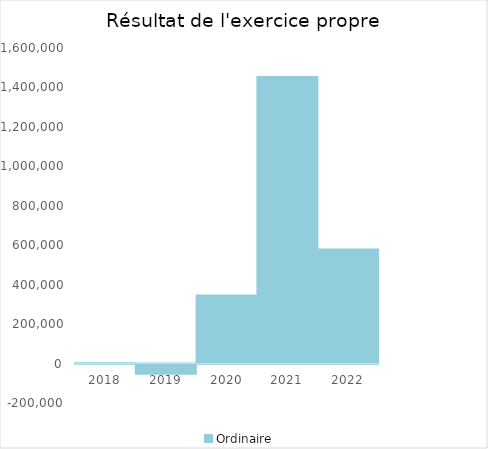
| Category |   | Ordinaire |    |
|---|---|---|---|
| 2018.0 |  | 1291.15 |  |
| 2019.0 |  | -49924.62 |  |
| 2020.0 |  | 345611.68 |  |
| 2021.0 |  | 1452875.73 |  |
| 2022.0 |  | 578496.72 |  |